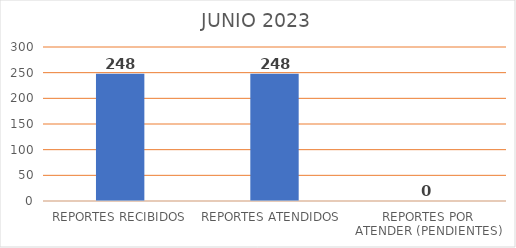
| Category | Series 0 |
|---|---|
| REPORTES RECIBIDOS | 248 |
| REPORTES ATENDIDOS  | 248 |
| REPORTES POR ATENDER (PENDIENTES) | 0 |